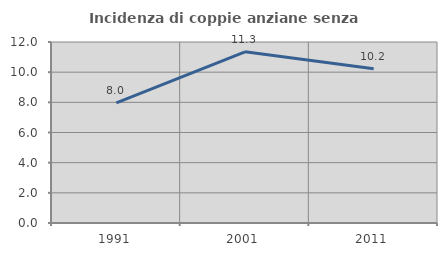
| Category | Incidenza di coppie anziane senza figli  |
|---|---|
| 1991.0 | 7.963 |
| 2001.0 | 11.348 |
| 2011.0 | 10.226 |